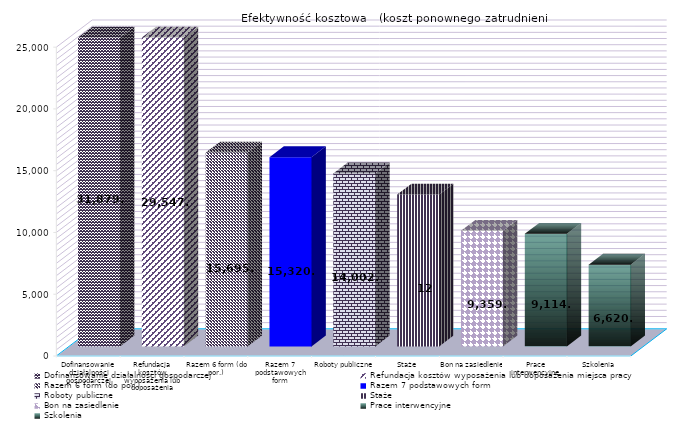
| Category | Efektywność kosztowa (w proc.) |
|---|---|
| Dofinansowanie działalności gospodarczej | 31878.975 |
| Refundacja kosztów wyposażenia lub doposażenia miejsca pracy | 29547.404 |
| Razem 6 form (do por.) | 15695.295 |
| Razem 7 podstawowych form | 15320.116 |
| Roboty publiczne | 14002.899 |
| Staże | 12296.068 |
| Bon na zasiedlenie | 9359.372 |
| Prace interwencyjne | 9114.348 |
| Szkolenia | 6620.388 |